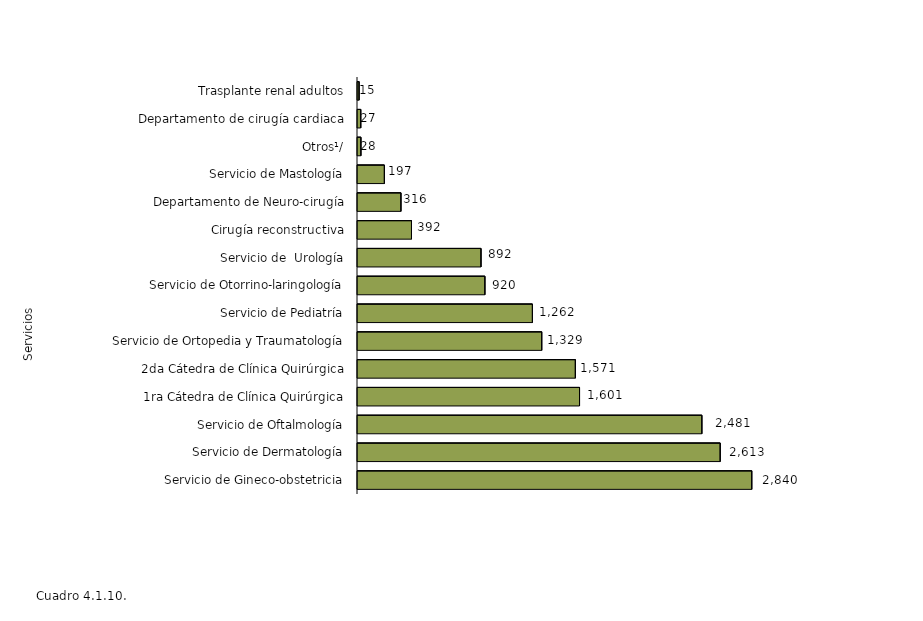
| Category | Series 0 |
|---|---|
| Servicio de Gineco-obstetricia | 2840 |
| Servicio de Dermatología | 2613 |
| Servicio de Oftalmología | 2481 |
| 1ra Cátedra de Clínica Quirúrgica | 1601 |
| 2da Cátedra de Clínica Quirúrgica | 1571 |
| Servicio de Ortopedia y Traumatología | 1329 |
| Servicio de Pediatría | 1262 |
| Servicio de Otorrino-laringología | 920 |
| Servicio de  Urología | 892 |
| Cirugía reconstructiva | 392 |
| Departamento de Neuro-cirugía | 316 |
| Servicio de Mastología | 197 |
| Otros¹/ | 28 |
| Departamento de cirugía cardiaca | 27 |
| Trasplante renal adultos | 15 |